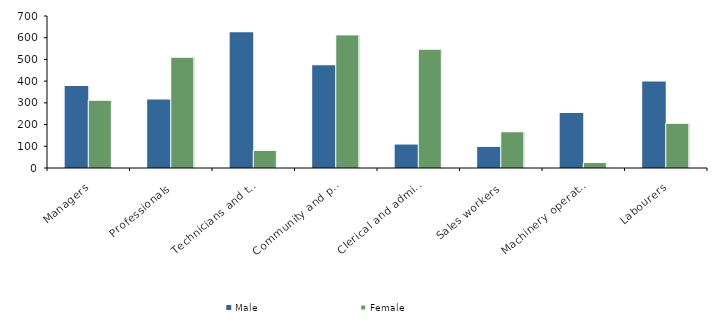
| Category | Male | Female |
|---|---|---|
| Managers | 378 | 312 |
| Professionals | 315 | 510 |
| Technicians and trades workers | 625 | 81 |
| Community and personal service workers | 473 | 613 |
| Clerical and administrative workers | 108 | 547 |
| Sales workers | 97 | 167 |
| Machinery operators and drivers | 253 | 25 |
| Labourers | 398 | 206 |